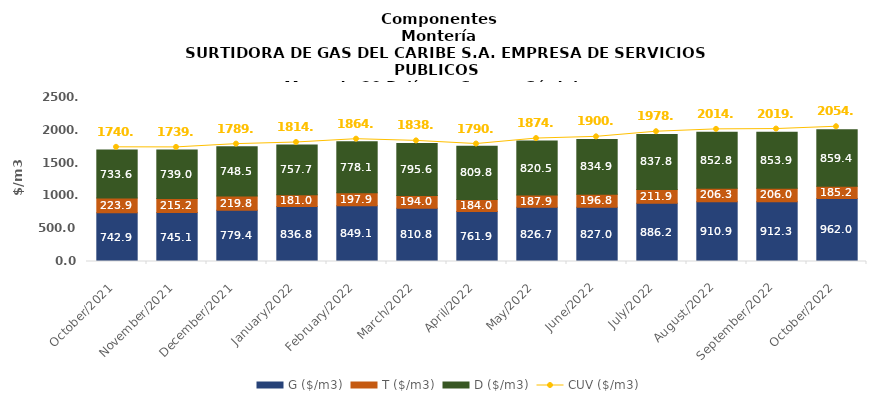
| Category | G ($/m3) | T ($/m3) | D ($/m3) |
|---|---|---|---|
| 2021-10-01 | 742.87 | 223.85 | 733.59 |
| 2021-11-01 | 745.07 | 215.21 | 738.96 |
| 2021-12-01 | 779.43 | 219.79 | 748.5 |
| 2022-01-01 | 836.83 | 180.95 | 757.71 |
| 2022-02-01 | 849.08 | 197.89 | 778.12 |
| 2022-03-01 | 810.81 | 194.02 | 795.6 |
| 2022-04-01 | 761.86 | 183.95 | 809.75 |
| 2022-05-01 | 826.7 | 187.86 | 820.54 |
| 2022-06-01 | 827.01 | 196.82 | 834.92 |
| 2022-07-01 | 886.17 | 211.86 | 837.8 |
| 2022-08-01 | 910.91 | 206.26 | 852.79 |
| 2022-09-01 | 912.26 | 206.01 | 853.9 |
| 2022-10-01 | 962.02 | 185.17 | 859.36 |